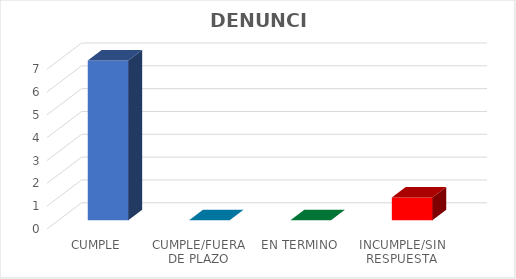
| Category | TOTAL |
|---|---|
| CUMPLE | 7 |
| CUMPLE/FUERA DE PLAZO | 0 |
| EN TERMINO | 0 |
| INCUMPLE/SIN RESPUESTA | 1 |